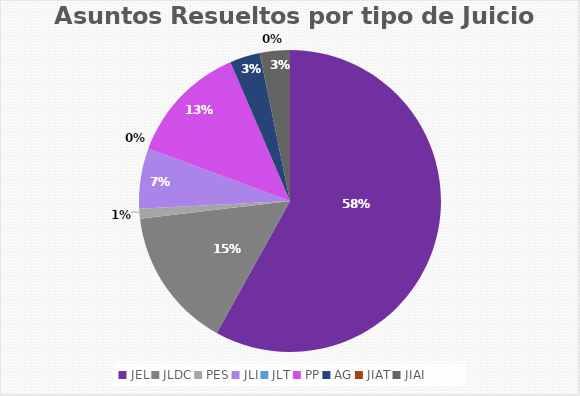
| Category | Asuntos Resueltos por tipo de Juicio  JULIO |
|---|---|
| JEL | 54 |
| JLDC | 14 |
| PES | 1 |
| JLI | 6 |
| JLT | 0 |
| PP | 12 |
| AG | 3 |
| JIAT | 0 |
| JIAI | 3 |